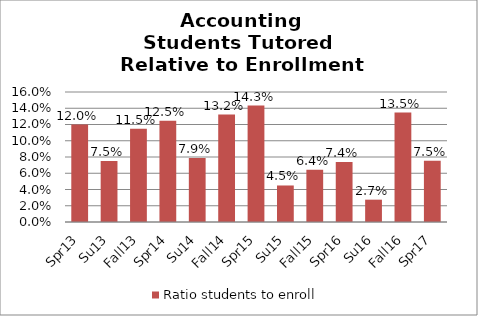
| Category | Ratio students to enroll |
|---|---|
| Spr13 | 0.12 |
| Su13 | 0.075 |
| Fall13 | 0.115 |
| Spr14 | 0.125 |
| Su14 | 0.079 |
| Fall14 | 0.132 |
| Spr15 | 0.143 |
| Su15 | 0.045 |
| Fall15 | 0.064 |
| Spr16 | 0.074 |
| Su16 | 0.027 |
| Fall16 | 0.135 |
| Spr17 | 0.075 |